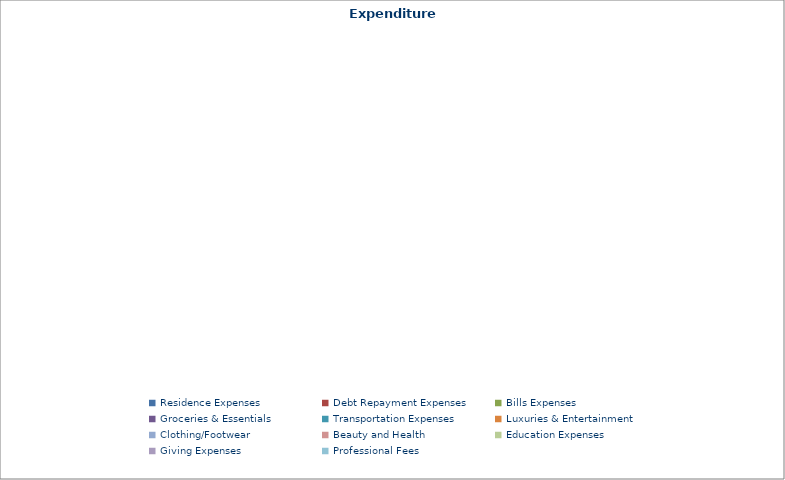
| Category | Series 0 |
|---|---|
| Residence Expenses | 0 |
| Debt Repayment Expenses | 0 |
| Bills Expenses | 0 |
| Groceries & Essentials | 0 |
| Transportation Expenses | 0 |
| Luxuries & Entertainment | 0 |
| Clothing/Footwear | 0 |
| Beauty and Health | 0 |
| Education Expenses | 0 |
| Giving Expenses | 0 |
| Professional Fees | 0 |